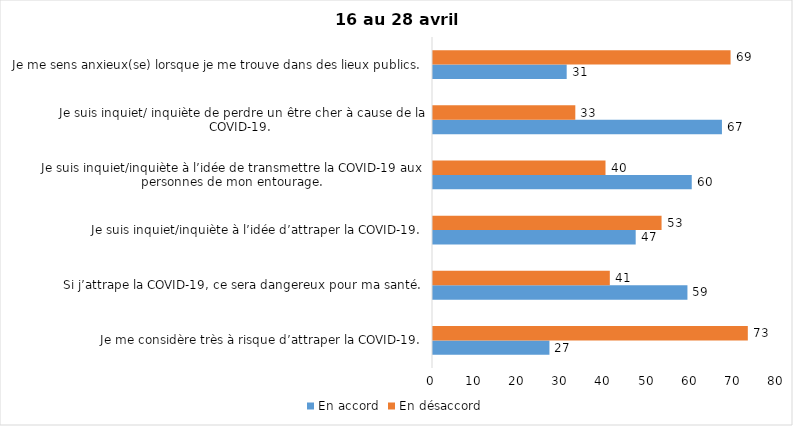
| Category | En accord | En désaccord |
|---|---|---|
| Je me considère très à risque d’attraper la COVID-19. | 27 | 73 |
| Si j’attrape la COVID-19, ce sera dangereux pour ma santé. | 59 | 41 |
| Je suis inquiet/inquiète à l’idée d’attraper la COVID-19. | 47 | 53 |
| Je suis inquiet/inquiète à l’idée de transmettre la COVID-19 aux personnes de mon entourage. | 60 | 40 |
| Je suis inquiet/ inquiète de perdre un être cher à cause de la COVID-19. | 67 | 33 |
| Je me sens anxieux(se) lorsque je me trouve dans des lieux publics. | 31 | 69 |